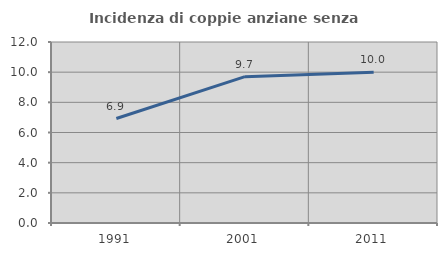
| Category | Incidenza di coppie anziane senza figli  |
|---|---|
| 1991.0 | 6.928 |
| 2001.0 | 9.704 |
| 2011.0 | 10 |